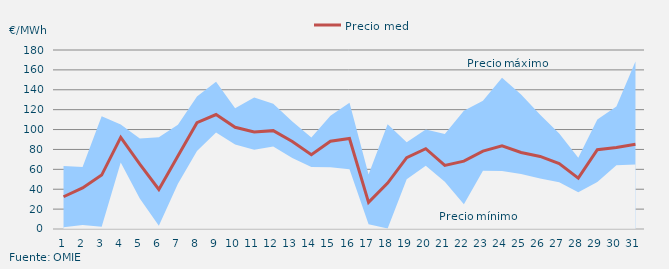
| Category | Precio medio |
|---|---|
| 1.0 | 32.436 |
| 2.0 | 41.345 |
| 3.0 | 54.208 |
| 4.0 | 92.176 |
| 5.0 | 65.24 |
| 6.0 | 39.748 |
| 7.0 | 73.329 |
| 8.0 | 106.87 |
| 9.0 | 115.126 |
| 10.0 | 102.292 |
| 11.0 | 97.65 |
| 12.0 | 98.905 |
| 13.0 | 87.927 |
| 14.0 | 74.626 |
| 15.0 | 88.256 |
| 16.0 | 91.004 |
| 17.0 | 26.842 |
| 18.0 | 46.205 |
| 19.0 | 71.696 |
| 20.0 | 80.776 |
| 21.0 | 63.891 |
| 22.0 | 68.255 |
| 23.0 | 78.381 |
| 24.0 | 83.571 |
| 25.0 | 76.932 |
| 26.0 | 72.95 |
| 27.0 | 65.698 |
| 28.0 | 51.209 |
| 29.0 | 79.759 |
| 30.0 | 81.984 |
| 31.0 | 85.249 |